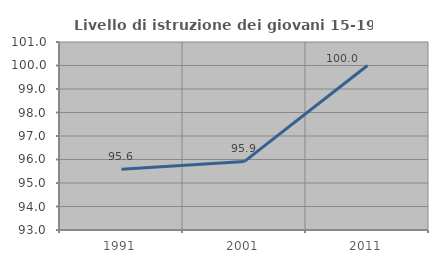
| Category | Livello di istruzione dei giovani 15-19 anni |
|---|---|
| 1991.0 | 95.588 |
| 2001.0 | 95.918 |
| 2011.0 | 100 |